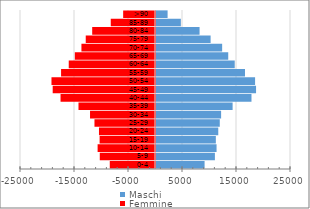
| Category | Maschi | Femmine |
|---|---|---|
| 0-4 | 8997 | -8375 |
| 5-9 | 10909 | -10226 |
| 10-14 | 11215 | -10627 |
| 15-19 | 11082 | -10257 |
| 20-24 | 11532 | -10375 |
| 25-29 | 11810 | -11209 |
| 30-34 | 12057 | -12031 |
| 35-39 | 14188 | -14169 |
| 40-44 | 17682 | -17492 |
| 45-49 | 18528 | -18945 |
| 50-54 | 18350 | -19170 |
| 55-59 | 16481 | -17394 |
| 60-64 | 14580 | -15974 |
| 65-69 | 13377 | -14847 |
| 70-74 | 12250 | -13624 |
| 75-79 | 10113 | -12825 |
| 80-84 | 8068 | -11630 |
| 85-89 | 4603 | -8192 |
| >90 | 2148 | -5896 |